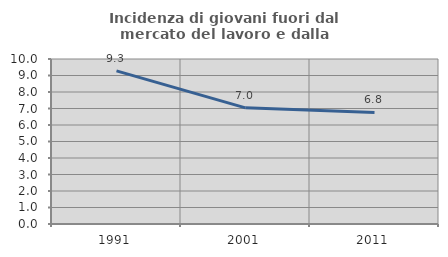
| Category | Incidenza di giovani fuori dal mercato del lavoro e dalla formazione  |
|---|---|
| 1991.0 | 9.278 |
| 2001.0 | 7.038 |
| 2011.0 | 6.765 |